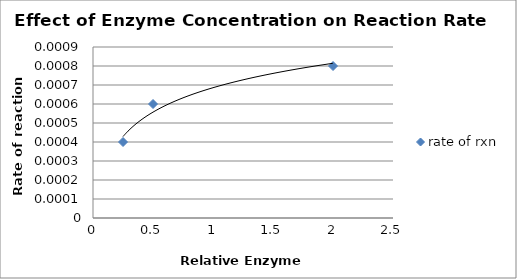
| Category | rate of rxn |
|---|---|
| 0.5 | 0.001 |
| 2.0 | 0.001 |
| 0.25 | 0 |